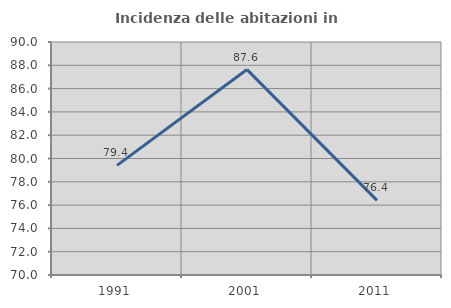
| Category | Incidenza delle abitazioni in proprietà  |
|---|---|
| 1991.0 | 79.412 |
| 2001.0 | 87.633 |
| 2011.0 | 76.408 |